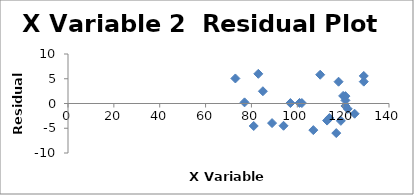
| Category | Series 0 |
|---|---|
| 110.0 | 5.812 |
| 97.0 | 0.086 |
| 107.0 | -5.375 |
| 117.0 | -5.978 |
| 101.0 | 0.117 |
| 85.0 | 2.475 |
| 77.0 | 0.229 |
| 122.0 | -1.079 |
| 119.0 | -3.504 |
| 89.0 | -3.956 |
| 81.0 | -4.543 |
| 120.0 | 1.536 |
| 121.0 | -0.504 |
| 113.0 | -3.451 |
| 102.0 | 0.094 |
| 129.0 | 5.565 |
| 83.0 | 5.996 |
| 118.0 | 4.402 |
| 125.0 | -2.067 |
| 94.0 | -4.499 |
| 121.0 | 0.624 |
| 114.0 | -2.939 |
| 73.0 | 5.057 |
| 121.0 | 1.488 |
| 129.0 | 4.414 |